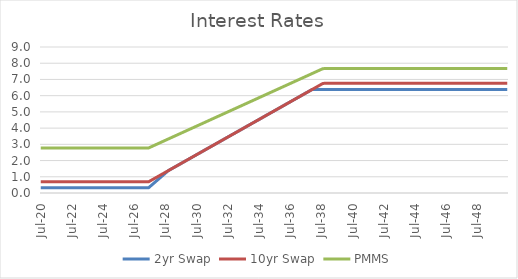
| Category | 2yr Swap | 10yr Swap | PMMS |
|---|---|---|---|
| 2020-07-31 | 0.32 | 0.69 | 2.775 |
| 2020-08-31 | 0.32 | 0.69 | 2.775 |
| 2020-09-30 | 0.32 | 0.69 | 2.775 |
| 2020-10-31 | 0.32 | 0.69 | 2.775 |
| 2020-11-30 | 0.32 | 0.69 | 2.775 |
| 2020-12-31 | 0.32 | 0.69 | 2.775 |
| 2021-01-31 | 0.32 | 0.69 | 2.775 |
| 2021-02-28 | 0.32 | 0.69 | 2.775 |
| 2021-03-31 | 0.32 | 0.69 | 2.775 |
| 2021-04-30 | 0.32 | 0.69 | 2.775 |
| 2021-05-31 | 0.32 | 0.69 | 2.775 |
| 2021-06-30 | 0.32 | 0.69 | 2.775 |
| 2021-07-31 | 0.32 | 0.69 | 2.775 |
| 2021-08-31 | 0.32 | 0.69 | 2.775 |
| 2021-09-30 | 0.32 | 0.69 | 2.775 |
| 2021-10-31 | 0.32 | 0.69 | 2.775 |
| 2021-11-30 | 0.32 | 0.69 | 2.775 |
| 2021-12-31 | 0.32 | 0.69 | 2.775 |
| 2022-01-31 | 0.32 | 0.69 | 2.775 |
| 2022-02-28 | 0.32 | 0.69 | 2.775 |
| 2022-03-31 | 0.32 | 0.69 | 2.775 |
| 2022-04-30 | 0.32 | 0.69 | 2.775 |
| 2022-05-31 | 0.32 | 0.69 | 2.775 |
| 2022-06-30 | 0.32 | 0.69 | 2.775 |
| 2022-07-31 | 0.32 | 0.69 | 2.775 |
| 2022-08-31 | 0.32 | 0.69 | 2.775 |
| 2022-09-30 | 0.32 | 0.69 | 2.775 |
| 2022-10-31 | 0.32 | 0.69 | 2.775 |
| 2022-11-30 | 0.32 | 0.69 | 2.775 |
| 2022-12-31 | 0.32 | 0.69 | 2.775 |
| 2023-01-31 | 0.32 | 0.69 | 2.775 |
| 2023-02-28 | 0.32 | 0.69 | 2.775 |
| 2023-03-31 | 0.32 | 0.69 | 2.775 |
| 2023-04-30 | 0.32 | 0.69 | 2.775 |
| 2023-05-31 | 0.32 | 0.69 | 2.775 |
| 2023-06-30 | 0.32 | 0.69 | 2.775 |
| 2023-07-31 | 0.32 | 0.69 | 2.775 |
| 2023-08-31 | 0.32 | 0.69 | 2.775 |
| 2023-09-30 | 0.32 | 0.69 | 2.775 |
| 2023-10-31 | 0.32 | 0.69 | 2.775 |
| 2023-11-30 | 0.32 | 0.69 | 2.775 |
| 2023-12-31 | 0.32 | 0.69 | 2.775 |
| 2024-01-31 | 0.32 | 0.69 | 2.775 |
| 2024-02-29 | 0.32 | 0.69 | 2.775 |
| 2024-03-31 | 0.32 | 0.69 | 2.775 |
| 2024-04-30 | 0.32 | 0.69 | 2.775 |
| 2024-05-31 | 0.32 | 0.69 | 2.775 |
| 2024-06-30 | 0.32 | 0.69 | 2.775 |
| 2024-07-31 | 0.32 | 0.69 | 2.775 |
| 2024-08-31 | 0.32 | 0.69 | 2.775 |
| 2024-09-30 | 0.32 | 0.69 | 2.775 |
| 2024-10-31 | 0.32 | 0.69 | 2.775 |
| 2024-11-30 | 0.32 | 0.69 | 2.775 |
| 2024-12-31 | 0.32 | 0.69 | 2.775 |
| 2025-01-31 | 0.32 | 0.69 | 2.775 |
| 2025-02-28 | 0.32 | 0.69 | 2.775 |
| 2025-03-31 | 0.32 | 0.69 | 2.775 |
| 2025-04-30 | 0.32 | 0.69 | 2.775 |
| 2025-05-31 | 0.32 | 0.69 | 2.775 |
| 2025-06-30 | 0.32 | 0.69 | 2.775 |
| 2025-07-31 | 0.32 | 0.69 | 2.775 |
| 2025-08-31 | 0.32 | 0.69 | 2.775 |
| 2025-09-30 | 0.32 | 0.69 | 2.775 |
| 2025-10-31 | 0.32 | 0.69 | 2.775 |
| 2025-11-30 | 0.32 | 0.69 | 2.775 |
| 2025-12-31 | 0.32 | 0.69 | 2.775 |
| 2026-01-31 | 0.32 | 0.69 | 2.775 |
| 2026-02-28 | 0.32 | 0.69 | 2.775 |
| 2026-03-31 | 0.32 | 0.69 | 2.775 |
| 2026-04-30 | 0.32 | 0.69 | 2.775 |
| 2026-05-31 | 0.32 | 0.69 | 2.775 |
| 2026-06-30 | 0.32 | 0.69 | 2.775 |
| 2026-07-31 | 0.32 | 0.69 | 2.775 |
| 2026-08-31 | 0.32 | 0.69 | 2.775 |
| 2026-09-30 | 0.32 | 0.69 | 2.775 |
| 2026-10-31 | 0.32 | 0.69 | 2.775 |
| 2026-11-30 | 0.32 | 0.69 | 2.775 |
| 2026-12-31 | 0.32 | 0.69 | 2.775 |
| 2027-01-31 | 0.32 | 0.69 | 2.775 |
| 2027-02-28 | 0.32 | 0.69 | 2.775 |
| 2027-03-31 | 0.32 | 0.69 | 2.775 |
| 2027-04-30 | 0.32 | 0.69 | 2.775 |
| 2027-05-31 | 0.32 | 0.69 | 2.775 |
| 2027-06-30 | 0.32 | 0.69 | 2.775 |
| 2027-07-31 | 0.39 | 0.735 | 2.812 |
| 2027-08-31 | 0.46 | 0.781 | 2.848 |
| 2027-09-30 | 0.529 | 0.826 | 2.885 |
| 2027-10-31 | 0.599 | 0.871 | 2.921 |
| 2027-11-30 | 0.669 | 0.916 | 2.958 |
| 2027-12-31 | 0.738 | 0.962 | 2.994 |
| 2028-01-31 | 0.808 | 1.007 | 3.031 |
| 2028-02-29 | 0.878 | 1.052 | 3.067 |
| 2028-03-31 | 0.947 | 1.097 | 3.104 |
| 2028-04-30 | 1.017 | 1.142 | 3.14 |
| 2028-05-31 | 1.087 | 1.188 | 3.177 |
| 2028-06-30 | 1.156 | 1.233 | 3.213 |
| 2028-07-31 | 1.226 | 1.278 | 3.25 |
| 2028-08-31 | 1.296 | 1.323 | 3.286 |
| 2028-09-30 | 1.365 | 1.369 | 3.323 |
| 2028-10-31 | 1.414 | 1.414 | 3.359 |
| 2028-11-30 | 1.459 | 1.459 | 3.395 |
| 2028-12-31 | 1.504 | 1.504 | 3.432 |
| 2029-01-31 | 1.549 | 1.549 | 3.468 |
| 2029-02-28 | 1.595 | 1.595 | 3.505 |
| 2029-03-31 | 1.64 | 1.64 | 3.541 |
| 2029-04-30 | 1.685 | 1.685 | 3.578 |
| 2029-05-31 | 1.73 | 1.73 | 3.614 |
| 2029-06-30 | 1.775 | 1.775 | 3.651 |
| 2029-07-31 | 1.821 | 1.821 | 3.687 |
| 2029-08-31 | 1.866 | 1.866 | 3.724 |
| 2029-09-30 | 1.911 | 1.911 | 3.76 |
| 2029-10-31 | 1.956 | 1.956 | 3.797 |
| 2029-11-30 | 2.002 | 2.002 | 3.833 |
| 2029-12-31 | 2.047 | 2.047 | 3.869 |
| 2030-01-31 | 2.092 | 2.092 | 3.906 |
| 2030-02-28 | 2.137 | 2.137 | 3.942 |
| 2030-03-31 | 2.182 | 2.182 | 3.979 |
| 2030-04-30 | 2.228 | 2.228 | 4.015 |
| 2030-05-31 | 2.273 | 2.273 | 4.052 |
| 2030-06-30 | 2.318 | 2.318 | 4.088 |
| 2030-07-31 | 2.363 | 2.363 | 4.125 |
| 2030-08-31 | 2.409 | 2.409 | 4.161 |
| 2030-09-30 | 2.454 | 2.454 | 4.198 |
| 2030-10-31 | 2.499 | 2.499 | 4.234 |
| 2030-11-30 | 2.544 | 2.544 | 4.271 |
| 2030-12-31 | 2.589 | 2.589 | 4.307 |
| 2031-01-31 | 2.635 | 2.635 | 4.343 |
| 2031-02-28 | 2.68 | 2.68 | 4.38 |
| 2031-03-31 | 2.725 | 2.725 | 4.416 |
| 2031-04-30 | 2.77 | 2.77 | 4.453 |
| 2031-05-31 | 2.816 | 2.816 | 4.489 |
| 2031-06-30 | 2.861 | 2.861 | 4.526 |
| 2031-07-31 | 2.906 | 2.906 | 4.562 |
| 2031-08-31 | 2.951 | 2.951 | 4.599 |
| 2031-09-30 | 2.996 | 2.996 | 4.635 |
| 2031-10-31 | 3.042 | 3.042 | 4.672 |
| 2031-11-30 | 3.087 | 3.087 | 4.708 |
| 2031-12-31 | 3.132 | 3.132 | 4.745 |
| 2032-01-31 | 3.177 | 3.177 | 4.781 |
| 2032-02-29 | 3.223 | 3.223 | 4.817 |
| 2032-03-31 | 3.268 | 3.268 | 4.854 |
| 2032-04-30 | 3.313 | 3.313 | 4.89 |
| 2032-05-31 | 3.358 | 3.358 | 4.927 |
| 2032-06-30 | 3.403 | 3.403 | 4.963 |
| 2032-07-31 | 3.449 | 3.449 | 5 |
| 2032-08-31 | 3.494 | 3.494 | 5.036 |
| 2032-09-30 | 3.539 | 3.539 | 5.073 |
| 2032-10-31 | 3.584 | 3.584 | 5.109 |
| 2032-11-30 | 3.63 | 3.63 | 5.146 |
| 2032-12-31 | 3.675 | 3.675 | 5.182 |
| 2033-01-31 | 3.72 | 3.72 | 5.219 |
| 2033-02-28 | 3.765 | 3.765 | 5.255 |
| 2033-03-31 | 3.81 | 3.81 | 5.291 |
| 2033-04-30 | 3.856 | 3.856 | 5.328 |
| 2033-05-31 | 3.901 | 3.901 | 5.364 |
| 2033-06-30 | 3.946 | 3.946 | 5.401 |
| 2033-07-31 | 3.991 | 3.991 | 5.437 |
| 2033-08-31 | 4.037 | 4.037 | 5.474 |
| 2033-09-30 | 4.082 | 4.082 | 5.51 |
| 2033-10-31 | 4.127 | 4.127 | 5.547 |
| 2033-11-30 | 4.172 | 4.172 | 5.583 |
| 2033-12-31 | 4.217 | 4.217 | 5.62 |
| 2034-01-31 | 4.263 | 4.263 | 5.656 |
| 2034-02-28 | 4.308 | 4.308 | 5.693 |
| 2034-03-31 | 4.353 | 4.353 | 5.729 |
| 2034-04-30 | 4.398 | 4.398 | 5.765 |
| 2034-05-31 | 4.444 | 4.444 | 5.802 |
| 2034-06-30 | 4.489 | 4.489 | 5.838 |
| 2034-07-31 | 4.534 | 4.534 | 5.875 |
| 2034-08-31 | 4.579 | 4.579 | 5.911 |
| 2034-09-30 | 4.624 | 4.624 | 5.948 |
| 2034-10-31 | 4.67 | 4.67 | 5.984 |
| 2034-11-30 | 4.715 | 4.715 | 6.021 |
| 2034-12-31 | 4.76 | 4.76 | 6.057 |
| 2035-01-31 | 4.805 | 4.805 | 6.094 |
| 2035-02-28 | 4.85 | 4.85 | 6.13 |
| 2035-03-31 | 4.896 | 4.896 | 6.167 |
| 2035-04-30 | 4.941 | 4.941 | 6.203 |
| 2035-05-31 | 4.986 | 4.986 | 6.239 |
| 2035-06-30 | 5.031 | 5.031 | 6.276 |
| 2035-07-31 | 5.077 | 5.077 | 6.312 |
| 2035-08-31 | 5.122 | 5.122 | 6.349 |
| 2035-09-30 | 5.167 | 5.167 | 6.385 |
| 2035-10-31 | 5.212 | 5.212 | 6.422 |
| 2035-11-30 | 5.257 | 5.257 | 6.458 |
| 2035-12-31 | 5.303 | 5.303 | 6.495 |
| 2036-01-31 | 5.348 | 5.348 | 6.531 |
| 2036-02-29 | 5.393 | 5.393 | 6.568 |
| 2036-03-31 | 5.438 | 5.438 | 6.604 |
| 2036-04-30 | 5.484 | 5.484 | 6.641 |
| 2036-05-31 | 5.529 | 5.529 | 6.677 |
| 2036-06-30 | 5.574 | 5.574 | 6.714 |
| 2036-07-31 | 5.619 | 5.619 | 6.75 |
| 2036-08-31 | 5.664 | 5.664 | 6.786 |
| 2036-09-30 | 5.71 | 5.71 | 6.823 |
| 2036-10-31 | 5.755 | 5.755 | 6.859 |
| 2036-11-30 | 5.8 | 5.8 | 6.896 |
| 2036-12-31 | 5.845 | 5.845 | 6.932 |
| 2037-01-31 | 5.891 | 5.891 | 6.969 |
| 2037-02-28 | 5.936 | 5.936 | 7.005 |
| 2037-03-31 | 5.981 | 5.981 | 7.042 |
| 2037-04-30 | 6.026 | 6.026 | 7.078 |
| 2037-05-31 | 6.071 | 6.071 | 7.115 |
| 2037-06-30 | 6.117 | 6.117 | 7.151 |
| 2037-07-31 | 6.162 | 6.162 | 7.188 |
| 2037-08-31 | 6.207 | 6.207 | 7.224 |
| 2037-09-30 | 6.252 | 6.252 | 7.26 |
| 2037-10-31 | 6.298 | 6.298 | 7.297 |
| 2037-11-30 | 6.343 | 6.343 | 7.333 |
| 2037-12-31 | 6.387 | 6.388 | 7.37 |
| 2038-01-31 | 6.387 | 6.433 | 7.406 |
| 2038-02-28 | 6.387 | 6.478 | 7.443 |
| 2038-03-31 | 6.387 | 6.524 | 7.479 |
| 2038-04-30 | 6.387 | 6.569 | 7.516 |
| 2038-05-31 | 6.387 | 6.614 | 7.552 |
| 2038-06-30 | 6.387 | 6.659 | 7.588 |
| 2038-07-31 | 6.387 | 6.705 | 7.625 |
| 2038-08-31 | 6.387 | 6.75 | 7.661 |
| 2038-09-30 | 6.387 | 6.758 | 7.668 |
| 2038-10-31 | 6.387 | 6.758 | 7.668 |
| 2038-11-30 | 6.387 | 6.758 | 7.668 |
| 2038-12-31 | 6.387 | 6.758 | 7.668 |
| 2039-01-31 | 6.387 | 6.758 | 7.668 |
| 2039-02-28 | 6.387 | 6.758 | 7.668 |
| 2039-03-31 | 6.387 | 6.758 | 7.668 |
| 2039-04-30 | 6.387 | 6.758 | 7.668 |
| 2039-05-31 | 6.387 | 6.758 | 7.668 |
| 2039-06-30 | 6.387 | 6.758 | 7.668 |
| 2039-07-31 | 6.387 | 6.758 | 7.668 |
| 2039-08-31 | 6.387 | 6.758 | 7.668 |
| 2039-09-30 | 6.387 | 6.758 | 7.668 |
| 2039-10-31 | 6.387 | 6.758 | 7.668 |
| 2039-11-30 | 6.387 | 6.758 | 7.668 |
| 2039-12-31 | 6.387 | 6.758 | 7.668 |
| 2040-01-31 | 6.387 | 6.758 | 7.668 |
| 2040-02-29 | 6.387 | 6.758 | 7.668 |
| 2040-03-31 | 6.387 | 6.758 | 7.668 |
| 2040-04-30 | 6.387 | 6.758 | 7.668 |
| 2040-05-31 | 6.387 | 6.758 | 7.668 |
| 2040-06-30 | 6.387 | 6.758 | 7.668 |
| 2040-07-31 | 6.387 | 6.758 | 7.668 |
| 2040-08-31 | 6.387 | 6.758 | 7.668 |
| 2040-09-30 | 6.387 | 6.758 | 7.668 |
| 2040-10-31 | 6.387 | 6.758 | 7.668 |
| 2040-11-30 | 6.387 | 6.758 | 7.668 |
| 2040-12-31 | 6.387 | 6.758 | 7.668 |
| 2041-01-31 | 6.387 | 6.758 | 7.668 |
| 2041-02-28 | 6.387 | 6.758 | 7.668 |
| 2041-03-31 | 6.387 | 6.758 | 7.668 |
| 2041-04-30 | 6.387 | 6.758 | 7.668 |
| 2041-05-31 | 6.387 | 6.758 | 7.668 |
| 2041-06-30 | 6.387 | 6.758 | 7.668 |
| 2041-07-31 | 6.387 | 6.758 | 7.668 |
| 2041-08-31 | 6.387 | 6.758 | 7.668 |
| 2041-09-30 | 6.387 | 6.758 | 7.668 |
| 2041-10-31 | 6.387 | 6.758 | 7.668 |
| 2041-11-30 | 6.387 | 6.758 | 7.668 |
| 2041-12-31 | 6.387 | 6.758 | 7.668 |
| 2042-01-31 | 6.387 | 6.758 | 7.668 |
| 2042-02-28 | 6.387 | 6.758 | 7.668 |
| 2042-03-31 | 6.387 | 6.758 | 7.668 |
| 2042-04-30 | 6.387 | 6.758 | 7.668 |
| 2042-05-31 | 6.387 | 6.758 | 7.668 |
| 2042-06-30 | 6.387 | 6.758 | 7.668 |
| 2042-07-31 | 6.387 | 6.758 | 7.668 |
| 2042-08-31 | 6.387 | 6.758 | 7.668 |
| 2042-09-30 | 6.387 | 6.758 | 7.668 |
| 2042-10-31 | 6.387 | 6.758 | 7.668 |
| 2042-11-30 | 6.387 | 6.758 | 7.668 |
| 2042-12-31 | 6.387 | 6.758 | 7.668 |
| 2043-01-31 | 6.387 | 6.758 | 7.668 |
| 2043-02-28 | 6.387 | 6.758 | 7.668 |
| 2043-03-31 | 6.387 | 6.758 | 7.668 |
| 2043-04-30 | 6.387 | 6.758 | 7.668 |
| 2043-05-31 | 6.387 | 6.758 | 7.668 |
| 2043-06-30 | 6.387 | 6.758 | 7.668 |
| 2043-07-31 | 6.387 | 6.758 | 7.668 |
| 2043-08-31 | 6.387 | 6.758 | 7.668 |
| 2043-09-30 | 6.387 | 6.758 | 7.668 |
| 2043-10-31 | 6.387 | 6.758 | 7.668 |
| 2043-11-30 | 6.387 | 6.758 | 7.668 |
| 2043-12-31 | 6.387 | 6.758 | 7.668 |
| 2044-01-31 | 6.387 | 6.758 | 7.668 |
| 2044-02-29 | 6.387 | 6.758 | 7.668 |
| 2044-03-31 | 6.387 | 6.758 | 7.668 |
| 2044-04-30 | 6.387 | 6.758 | 7.668 |
| 2044-05-31 | 6.387 | 6.758 | 7.668 |
| 2044-06-30 | 6.387 | 6.758 | 7.668 |
| 2044-07-31 | 6.387 | 6.758 | 7.668 |
| 2044-08-31 | 6.387 | 6.758 | 7.668 |
| 2044-09-30 | 6.387 | 6.758 | 7.668 |
| 2044-10-31 | 6.387 | 6.758 | 7.668 |
| 2044-11-30 | 6.387 | 6.758 | 7.668 |
| 2044-12-31 | 6.387 | 6.758 | 7.668 |
| 2045-01-31 | 6.387 | 6.758 | 7.668 |
| 2045-02-28 | 6.387 | 6.758 | 7.668 |
| 2045-03-31 | 6.387 | 6.758 | 7.668 |
| 2045-04-30 | 6.387 | 6.758 | 7.668 |
| 2045-05-31 | 6.387 | 6.758 | 7.668 |
| 2045-06-30 | 6.387 | 6.758 | 7.668 |
| 2045-07-31 | 6.387 | 6.758 | 7.668 |
| 2045-08-31 | 6.387 | 6.758 | 7.668 |
| 2045-09-30 | 6.387 | 6.758 | 7.668 |
| 2045-10-31 | 6.387 | 6.758 | 7.668 |
| 2045-11-30 | 6.387 | 6.758 | 7.668 |
| 2045-12-31 | 6.387 | 6.758 | 7.668 |
| 2046-01-31 | 6.387 | 6.758 | 7.668 |
| 2046-02-28 | 6.387 | 6.758 | 7.668 |
| 2046-03-31 | 6.387 | 6.758 | 7.668 |
| 2046-04-30 | 6.387 | 6.758 | 7.668 |
| 2046-05-31 | 6.387 | 6.758 | 7.668 |
| 2046-06-30 | 6.387 | 6.758 | 7.668 |
| 2046-07-31 | 6.387 | 6.758 | 7.668 |
| 2046-08-31 | 6.387 | 6.758 | 7.668 |
| 2046-09-30 | 6.387 | 6.758 | 7.668 |
| 2046-10-31 | 6.387 | 6.758 | 7.668 |
| 2046-11-30 | 6.387 | 6.758 | 7.668 |
| 2046-12-31 | 6.387 | 6.758 | 7.668 |
| 2047-01-31 | 6.387 | 6.758 | 7.668 |
| 2047-02-28 | 6.387 | 6.758 | 7.668 |
| 2047-03-31 | 6.387 | 6.758 | 7.668 |
| 2047-04-30 | 6.387 | 6.758 | 7.668 |
| 2047-05-31 | 6.387 | 6.758 | 7.668 |
| 2047-06-30 | 6.387 | 6.758 | 7.668 |
| 2047-07-31 | 6.387 | 6.758 | 7.668 |
| 2047-08-31 | 6.387 | 6.758 | 7.668 |
| 2047-09-30 | 6.387 | 6.758 | 7.668 |
| 2047-10-31 | 6.387 | 6.758 | 7.668 |
| 2047-11-30 | 6.387 | 6.758 | 7.668 |
| 2047-12-31 | 6.387 | 6.758 | 7.668 |
| 2048-01-31 | 6.387 | 6.758 | 7.668 |
| 2048-02-29 | 6.387 | 6.758 | 7.668 |
| 2048-03-31 | 6.387 | 6.758 | 7.668 |
| 2048-04-30 | 6.387 | 6.758 | 7.668 |
| 2048-05-31 | 6.387 | 6.758 | 7.668 |
| 2048-06-30 | 6.387 | 6.758 | 7.668 |
| 2048-07-31 | 6.387 | 6.758 | 7.668 |
| 2048-08-31 | 6.387 | 6.758 | 7.668 |
| 2048-09-30 | 6.387 | 6.758 | 7.668 |
| 2048-10-31 | 6.387 | 6.758 | 7.668 |
| 2048-11-30 | 6.387 | 6.758 | 7.668 |
| 2048-12-31 | 6.387 | 6.758 | 7.668 |
| 2049-01-31 | 6.387 | 6.758 | 7.668 |
| 2049-02-28 | 6.387 | 6.758 | 7.668 |
| 2049-03-31 | 6.387 | 6.758 | 7.668 |
| 2049-04-30 | 6.387 | 6.758 | 7.668 |
| 2049-05-31 | 6.387 | 6.758 | 7.668 |
| 2049-06-30 | 6.387 | 6.758 | 7.668 |
| 2049-07-31 | 6.387 | 6.758 | 7.668 |
| 2049-08-31 | 6.387 | 6.758 | 7.668 |
| 2049-09-30 | 6.387 | 6.758 | 7.668 |
| 2049-10-31 | 6.387 | 6.758 | 7.668 |
| 2049-11-30 | 6.387 | 6.758 | 7.668 |
| 2049-12-31 | 6.387 | 6.758 | 7.668 |
| 2050-01-31 | 6.387 | 6.758 | 7.668 |
| 2050-02-28 | 6.387 | 6.758 | 7.668 |
| 2050-03-31 | 6.387 | 6.758 | 7.668 |
| 2050-04-30 | 6.387 | 6.758 | 7.668 |
| 2050-05-31 | 6.387 | 6.758 | 7.668 |
| 2050-06-30 | 6.387 | 6.758 | 7.668 |